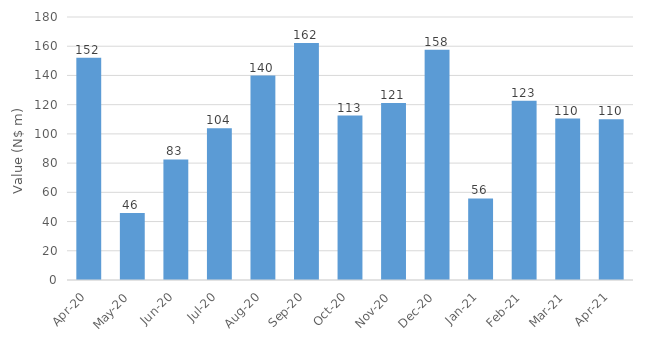
| Category | Series 0 |
|---|---|
| 2020-04-01 | 152.146 |
| 2020-05-01 | 45.9 |
| 2020-06-01 | 82.547 |
| 2020-07-01 | 103.82 |
| 2020-08-01 | 139.92 |
| 2020-09-01 | 162.182 |
| 2020-10-01 | 112.562 |
| 2020-11-01 | 121.18 |
| 2020-12-01 | 157.615 |
| 2021-01-01 | 55.804 |
| 2021-02-01 | 122.63 |
| 2021-03-01 | 110.467 |
| 2021-04-01 | 110.006 |